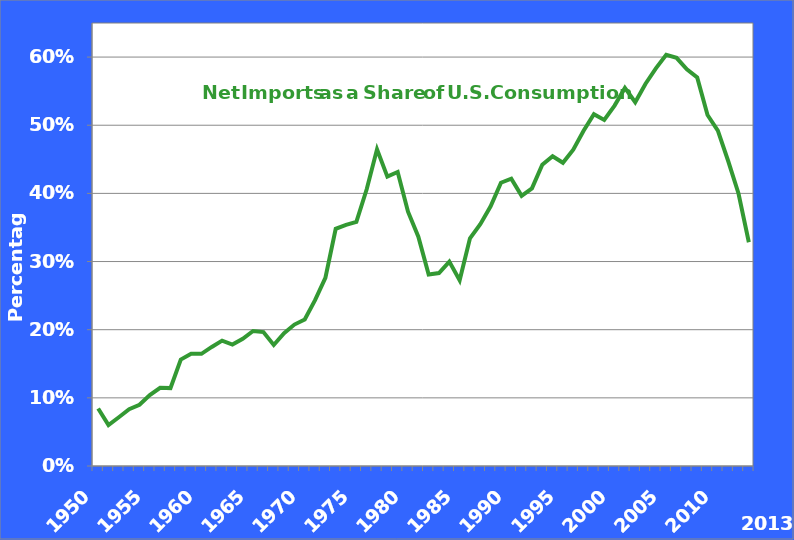
| Category | Series 0 |
|---|---|
| 1950.0 | 0.084 |
| 1951.0 | 0.06 |
| 1952.0 | 0.072 |
| 1953.0 | 0.083 |
| 1954.0 | 0.09 |
| 1955.0 | 0.104 |
| 1956.0 | 0.115 |
| 1957.0 | 0.114 |
| 1958.0 | 0.156 |
| 1959.0 | 0.165 |
| 1960.0 | 0.165 |
| 1961.0 | 0.175 |
| 1962.0 | 0.184 |
| 1963.0 | 0.178 |
| 1964.0 | 0.187 |
| 1965.0 | 0.198 |
| 1966.0 | 0.197 |
| 1967.0 | 0.178 |
| 1968.0 | 0.195 |
| 1969.0 | 0.207 |
| 1970.0 | 0.215 |
| 1971.0 | 0.243 |
| 1972.0 | 0.276 |
| 1973.0 | 0.348 |
| 1974.0 | 0.354 |
| 1975.0 | 0.358 |
| 1976.0 | 0.406 |
| 1977.0 | 0.465 |
| 1978.0 | 0.425 |
| 1979.0 | 0.431 |
| 1980.0 | 0.373 |
| 1981.0 | 0.336 |
| 1982.0 | 0.281 |
| 1983.0 | 0.283 |
| 1984.0 | 0.3 |
| 1985.0 | 0.273 |
| 1986.0 | 0.334 |
| 1987.0 | 0.355 |
| 1988.0 | 0.381 |
| 1989.0 | 0.416 |
| 1990.0 | 0.422 |
| 1991.0 | 0.396 |
| 1992.0 | 0.407 |
| 1993.0 | 0.442 |
| 1994.0 | 0.455 |
| 1995.0 | 0.445 |
| 1996.0 | 0.464 |
| 1997.0 | 0.492 |
| 1998.0 | 0.516 |
| 1999.0 | 0.508 |
| 2000.0 | 0.529 |
| 2001.0 | 0.555 |
| 2002.0 | 0.534 |
| 2003.0 | 0.561 |
| 2004.0 | 0.584 |
| 2005.0 | 0.603 |
| 2006.0 | 0.599 |
| 2007.0 | 0.582 |
| 2008.0 | 0.57 |
| 2009.0 | 0.515 |
| 2010.0 | 0.492 |
| 2011.0 | 0.448 |
| 2012.0 | 0.4 |
| 2013.0 | 0.328 |